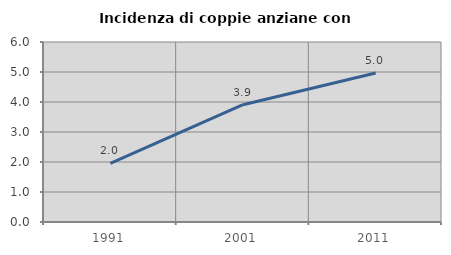
| Category | Incidenza di coppie anziane con figli |
|---|---|
| 1991.0 | 1.958 |
| 2001.0 | 3.91 |
| 2011.0 | 4.966 |